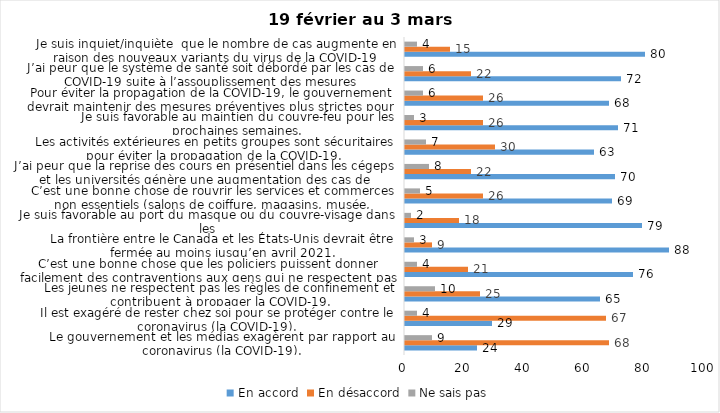
| Category | En accord | En désaccord | Ne sais pas |
|---|---|---|---|
| Le gouvernement et les médias exagèrent par rapport au coronavirus (la COVID-19). | 24 | 68 | 9 |
| Il est exagéré de rester chez soi pour se protéger contre le coronavirus (la COVID-19). | 29 | 67 | 4 |
| Les jeunes ne respectent pas les règles de confinement et contribuent à propager la COVID-19. | 65 | 25 | 10 |
| C’est une bonne chose que les policiers puissent donner facilement des contraventions aux gens qui ne respectent pas les mesures pour prévenir le coronavirus (la COVID-19). | 76 | 21 | 4 |
| La frontière entre le Canada et les États-Unis devrait être fermée au moins jusqu’en avril 2021. | 88 | 9 | 3 |
| Je suis favorable au port du masque ou du couvre-visage dans les
lieux publics extérieurs achalandés (ex. rues, parcs) | 79 | 18 | 2 |
| C’est une bonne chose de rouvrir les services et commerces non essentiels (salons de coiffure, magasins, musée, industries) à partir du 8 février 2021. | 69 | 26 | 5 |
| J’ai peur que la reprise des cours en présentiel dans les cégeps et les universités génère une augmentation des cas de COVID-19. | 70 | 22 | 8 |
| Les activités extérieures en petits groupes sont sécuritaires pour éviter la propagation de la COVID-19. | 63 | 30 | 7 |
| Je suis favorable au maintien du couvre-feu pour les prochaines semaines. | 71 | 26 | 3 |
| Pour éviter la propagation de la COVID-19, le gouvernement devrait maintenir des mesures préventives plus strictes pour la grande région de Montréal. | 68 | 26 | 6 |
| J’ai peur que le système de santé soit débordé par les cas de COVID-19 suite à l’assouplissement des mesures | 72 | 22 | 6 |
| Je suis inquiet/inquiète  que le nombre de cas augmente en raison des nouveaux variants du virus de la COVID-19 | 80 | 15 | 4 |